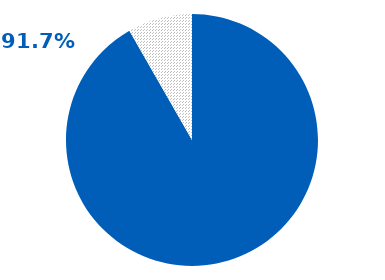
| Category | Series 4 | Series 5 | Series 6 | Series 7 | Series 2 | Series 3 | Series 1 | Series 0 |
|---|---|---|---|---|---|---|---|---|
| NACE | 0.917 | 0.917 | 0.917 | 0.917 | 0.917 | 0.917 | 0.917 | 0.917 |
| No_NACE | 0.083 | 0.083 | 0.083 | 0.083 | 0.083 | 0.083 | 0.083 | 0.083 |